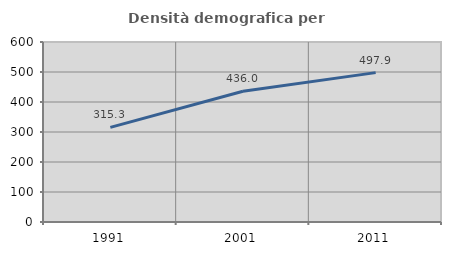
| Category | Densità demografica |
|---|---|
| 1991.0 | 315.269 |
| 2001.0 | 435.973 |
| 2011.0 | 497.903 |